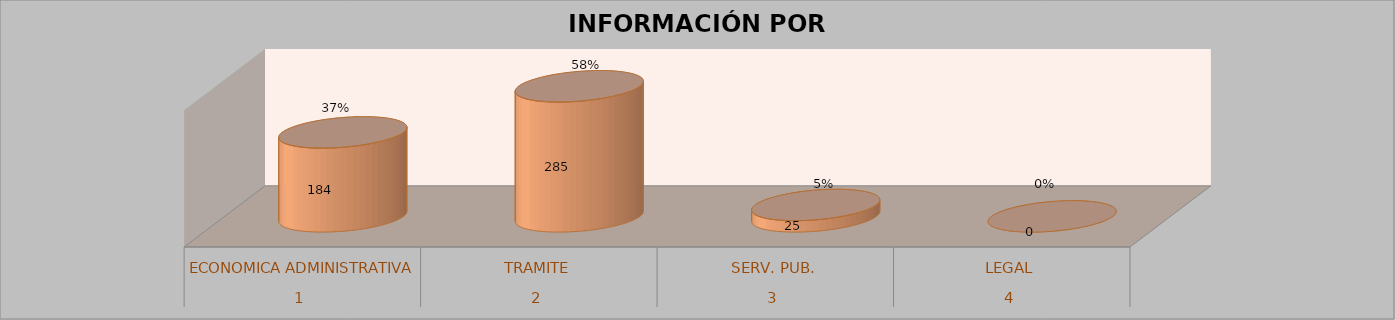
| Category | Series 0 | Series 1 | Series 2 | Series 3 |
|---|---|---|---|---|
| 0 |  |  | 184 | 0.372 |
| 1 |  |  | 285 | 0.577 |
| 2 |  |  | 25 | 0.051 |
| 3 |  |  | 0 | 0 |